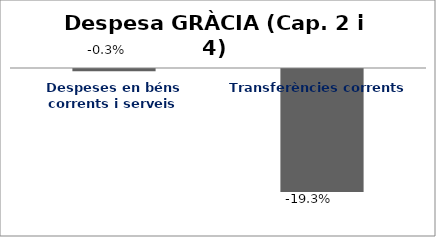
| Category | Series 0 |
|---|---|
| Despeses en béns corrents i serveis | -0.003 |
| Transferències corrents | -0.193 |